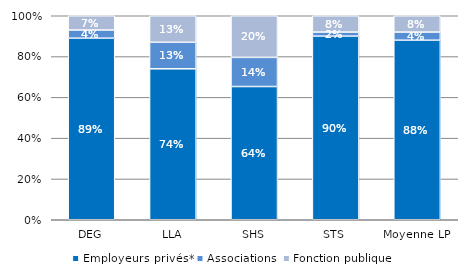
| Category | Employeurs privés* | Associations | Fonction publique |
|---|---|---|---|
| DEG | 0.89 | 0.04 | 0.07 |
| LLA | 0.74 | 0.13 | 0.13 |
| SHS | 0.64 | 0.14 | 0.2 |
| STS | 0.9 | 0.02 | 0.08 |
| Moyenne LP | 0.88 | 0.04 | 0.08 |